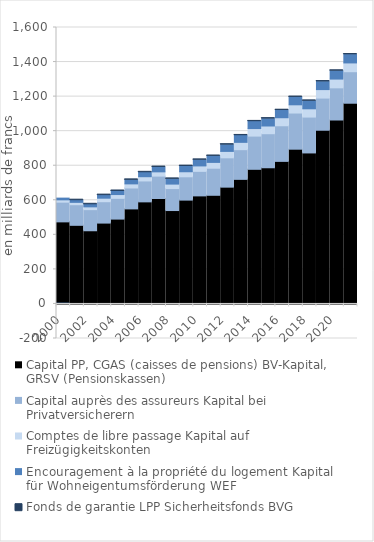
| Category | Capital PP, CGAS (caisses de pensions) | Capital auprès des assureurs | Comptes de libre passage | Encouragement à la propriété du logement | Fonds de garantie LPP |
|---|---|---|---|---|---|
| 2000 | 475.022 | 114.1 | 13.407 | 10.002 | -0.014 |
| 2001 | 455 | 119.3 | 13.688 | 12.507 | 0.013 |
| 2002 | 423.591 | 122.3 | 16.012 | 14.799 | 0.034 |
| 2003 | 468 | 123.7 | 20.36 | 17.687 | 0.078 |
| 2004 | 491.091 | 120.1 | 21.949 | 20.516 | 0.182 |
| 2005 | 550.1 | 121.1 | 23.7 | 23.024 | 0.344 |
| 2006 | 590.83 | 121.1 | 24.434 | 25.334 | 0.462 |
| 2007 | 610.382 | 129.553 | 24.618 | 27.571 | 0.577 |
| 2008 | 540.609 | 127 | 26.029 | 29.892 | 0.58 |
| 2009 | 600.945 | 135.007 | 29.154 | 32.475 | 0.747 |
| 2010 | 625.427 | 141.934 | 31.499 | 34.669 | 0.858 |
| 2011 | 628.842 | 156.754 | 33.615 | 36.728 | 0.997 |
| 2012 | 675.965 | 169.758 | 37.147 | 38.646 | 1.077 |
| 2013 | 721.054 | 171.903 | 42.302 | 40.011 | 1.126 |
| 2014 | 779.181 | 192.299 | 43.679 | 41.264 | 1.212 |
| 2015 | 788.177 | 197.116 | 44.636 | 42.4 | 1.146 |
| 2016 | 825.124 | 206.138 | 46.516 | 43.409 | 1.204 |
| 2017 | 895.597 | 209.353 | 47.655 | 44.466 | 1.267 |
| 2018 | 874.001 | 207.537 | 47.969 | 45.45 | 1.182 |
| 2019 | 1005.321 | 186.139 | 49.14 | 46.375 | 1.279 |
| 2020 | 1064.59 | 186.228 | 50.749 | 47.443 | 1.322 |
| 2021 | 1161.71 | 182.376 | 50.888 | 48.509 | 1.419 |